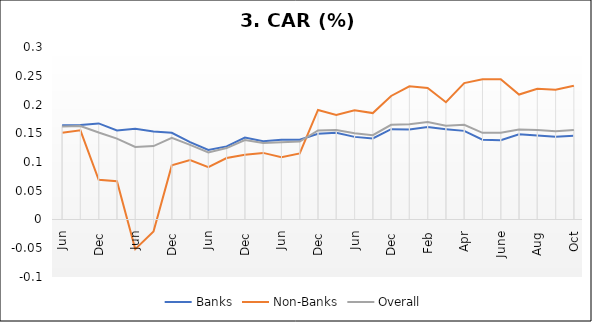
| Category | Banks | Non-Banks | Overall |
|---|---|---|---|
| 0 | 0.164 | 0.151 | 0.162 |
| 1 | 0.164 | 0.155 | 0.163 |
| 2 | 0.167 | 0.069 | 0.151 |
| 3 | 0.155 | 0.067 | 0.141 |
| 4 | 0.158 | -0.051 | 0.126 |
| 5 | 0.153 | -0.021 | 0.128 |
| 6 | 0.151 | 0.094 | 0.142 |
| 7 | 0.135 | 0.103 | 0.13 |
| 8 | 0.121 | 0.091 | 0.116 |
| 9 | 0.127 | 0.107 | 0.124 |
| 10 | 0.142 | 0.113 | 0.138 |
| 11 | 0.136 | 0.116 | 0.133 |
| 12 | 0.139 | 0.109 | 0.134 |
| 13 | 0.139 | 0.115 | 0.136 |
| 14 | 0.149 | 0.191 | 0.155 |
| 15 | 0.151 | 0.182 | 0.156 |
| 16 | 0.144 | 0.19 | 0.15 |
| 17 | 0.141 | 0.185 | 0.147 |
| 18 | 0.157 | 0.215 | 0.165 |
| 19 | 0.156 | 0.232 | 0.166 |
| 20 | 0.161 | 0.229 | 0.169 |
| 21 | 0.157 | 0.204 | 0.163 |
| 22 | 0.154 | 0.237 | 0.165 |
| 23 | 0.139 | 0.244 | 0.151 |
| 24 | 0.138 | 0.244 | 0.151 |
| 25 | 0.148 | 0.217 | 0.156 |
| 26 | 0.146 | 0.228 | 0.156 |
| 27 | 0.144 | 0.226 | 0.153 |
| 28 | 0.146 | 0.233 | 0.156 |